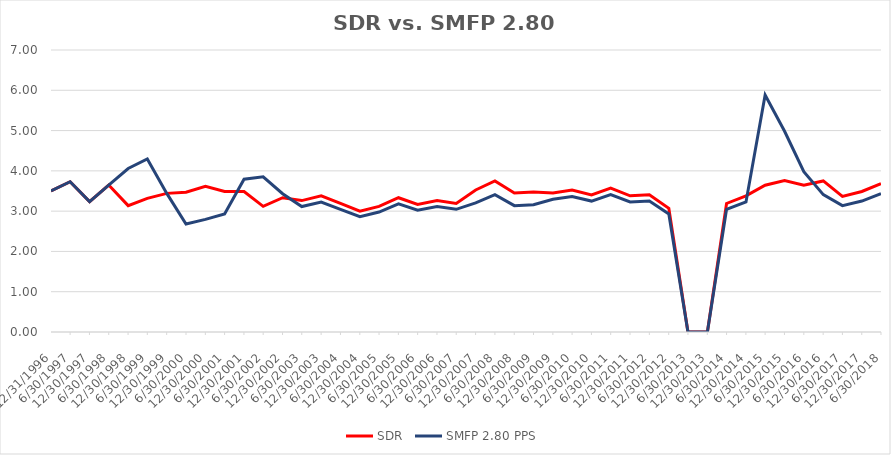
| Category | SDR | SMFP 2.80 PPS |
|---|---|---|
| 12/31/96 | 3.5 | 3.5 |
| 6/30/97 | 3.731 | 3.731 |
| 12/31/97 | 3.235 | 3.235 |
| 6/30/98 | 3.647 | 3.647 |
| 12/31/98 | 3.136 | 4.059 |
| 6/30/99 | 3.318 | 4.294 |
| 12/31/99 | 3.441 | 3.441 |
| 6/30/00 | 3.471 | 2.682 |
| 12/31/00 | 3.618 | 2.795 |
| 6/30/01 | 3.486 | 2.932 |
| 12/31/01 | 3.486 | 3.794 |
| 6/30/02 | 3.119 | 3.853 |
| 12/31/02 | 3.333 | 3.432 |
| 6/30/03 | 3.262 | 3.114 |
| 12/31/03 | 3.381 | 3.227 |
| 6/30/04 | 3.19 | 3.045 |
| 12/31/04 | 3 | 2.864 |
| 6/30/05 | 3.119 | 2.977 |
| 12/31/05 | 3.333 | 3.182 |
| 6/30/06 | 3.167 | 3.023 |
| 12/31/06 | 3.262 | 3.114 |
| 6/30/07 | 3.19 | 3.045 |
| 12/31/07 | 3.525 | 3.205 |
| 6/30/08 | 3.75 | 3.409 |
| 12/31/08 | 3.45 | 3.136 |
| 6/30/09 | 3.475 | 3.159 |
| 12/31/09 | 3.452 | 3.295 |
| 6/30/10 | 3.524 | 3.364 |
| 12/31/10 | 3.405 | 3.25 |
| 6/30/11 | 3.571 | 3.409 |
| 12/31/11 | 3.381 | 3.227 |
| 6/30/12 | 3.405 | 3.25 |
| 12/31/12 | 3.071 | 2.932 |
| 6/30/13 | 0 | 0 |
| 12/31/13 | 0 | 0 |
| 6/30/14 | 3.19 | 3.045 |
| 12/31/14 | 3.381 | 3.227 |
| 6/30/15 | 3.643 | 5.885 |
| 12/31/15 | 3.762 | 4.982 |
| 6/30/16 | 3.643 | 3.982 |
| 12/31/16 | 3.75 | 3.409 |
| 6/30/17 | 3.366 | 3.136 |
| 12/31/17 | 3.488 | 3.25 |
| 6/30/18 | 3.683 | 3.432 |